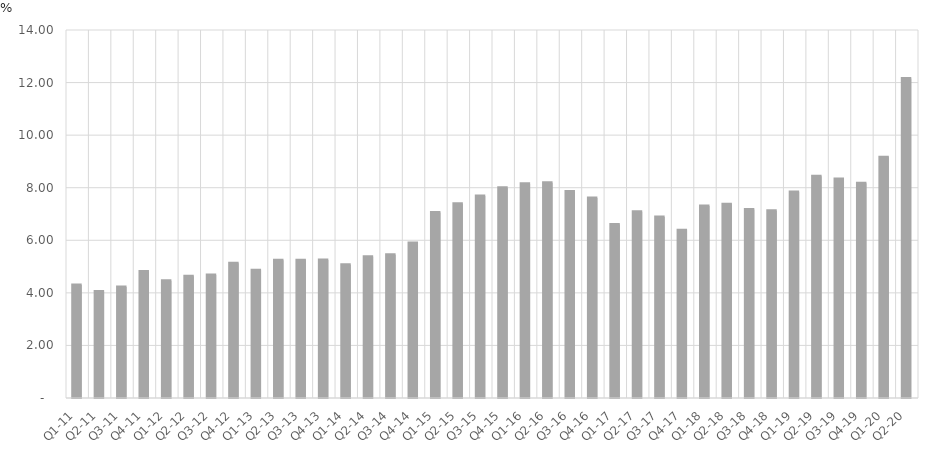
| Category | Percent of Total GDP |
|---|---|
| Q1-11 | 4.302 |
| Q2-11 | 4.047 |
| Q3-11 | 4.224 |
| Q4-11 | 4.817 |
| Q1-12 | 4.462 |
| Q2-12 | 4.631 |
| Q3-12 | 4.675 |
| Q4-12 | 5.131 |
| Q1-13 | 4.865 |
| Q2-13 | 5.244 |
| Q3-13 | 5.245 |
| Q4-13 | 5.248 |
| Q1-14 | 5.074 |
| Q2-14 | 5.374 |
| Q3-14 | 5.452 |
| Q4-14 | 5.898 |
| Q1-15 | 7.06 |
| Q2-15 | 7.386 |
| Q3-15 | 7.682 |
| Q4-15 | 8.003 |
| Q1-16 | 8.153 |
| Q2-16 | 8.184 |
| Q3-16 | 7.86 |
| Q4-16 | 7.604 |
| Q1-17 | 6.6 |
| Q2-17 | 7.089 |
| Q3-17 | 6.884 |
| Q4-17 | 6.383 |
| Q1-18 | 7.306 |
| Q2-18 | 7.371 |
| Q3-18 | 7.173 |
| Q4-18 | 7.121 |
| Q1-19 | 7.835 |
| Q2-19 | 8.437 |
| Q3-19 | 8.328 |
| Q4-19 | 8.171 |
| Q1-20 | 9.157 |
| Q2-20 | 12.155 |